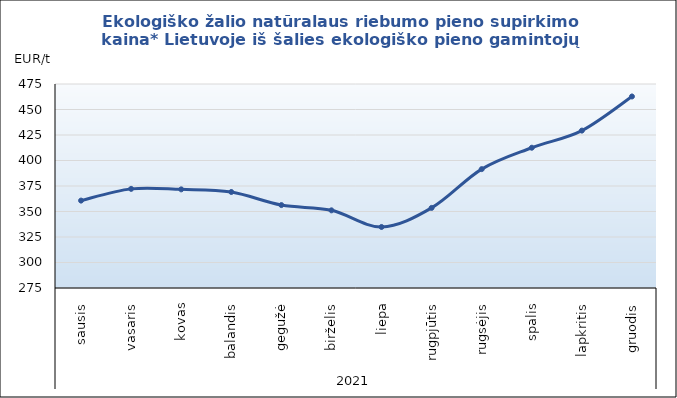
| Category | Ekologiško žalio natūralaus riebumo pieno supirkimo kaina* Lietuvoje iš šalies ekologiško pieno gamintojų |
|---|---|
| 0 | 360.68 |
| 1 | 372.19 |
| 2 | 371.7 |
| 3 | 369.13 |
| 4 | 356.29 |
| 5 | 351.14 |
| 6 | 334.83 |
| 7 | 353.53 |
| 8 | 391.54 |
| 9 | 412.51 |
| 10 | 429.3 |
| 11 | 462.77 |